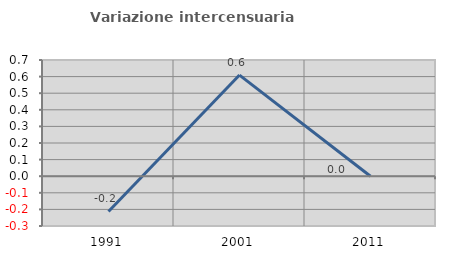
| Category | Variazione intercensuaria annua |
|---|---|
| 1991.0 | -0.212 |
| 2001.0 | 0.609 |
| 2011.0 | 0 |